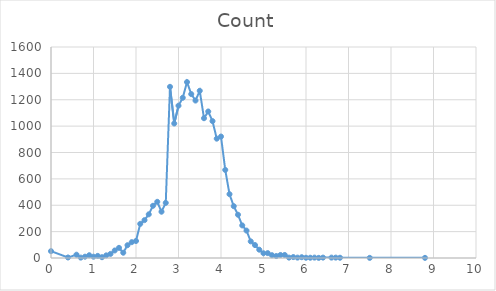
| Category | Count |
|---|---|
| 0.0 | 52 |
| 0.4 | 4 |
| 0.6 | 25 |
| 0.7 | 3 |
| 0.8 | 10 |
| 0.9 | 21 |
| 1.0 | 10 |
| 1.1 | 16 |
| 1.2 | 6 |
| 1.3 | 20 |
| 1.4 | 31 |
| 1.5 | 57 |
| 1.6 | 77 |
| 1.7 | 40 |
| 1.8 | 97 |
| 1.9 | 120 |
| 2.0 | 129 |
| 2.1 | 259 |
| 2.2 | 287 |
| 2.3 | 331 |
| 2.4 | 396 |
| 2.5 | 426 |
| 2.6 | 351 |
| 2.7 | 418 |
| 2.8 | 1298 |
| 2.9 | 1020 |
| 3.0 | 1155 |
| 3.1 | 1215 |
| 3.2 | 1334 |
| 3.3 | 1243 |
| 3.4 | 1194 |
| 3.5 | 1268 |
| 3.6 | 1060 |
| 3.7 | 1111 |
| 3.8 | 1038 |
| 3.9 | 905 |
| 4.0 | 921 |
| 4.1 | 668 |
| 4.2 | 484 |
| 4.3 | 393 |
| 4.4 | 328 |
| 4.5 | 247 |
| 4.6 | 208 |
| 4.7 | 126 |
| 4.8 | 98 |
| 4.9 | 63 |
| 5.0 | 36 |
| 5.1 | 37 |
| 5.2 | 21 |
| 5.3 | 15 |
| 5.4 | 23 |
| 5.5 | 23 |
| 5.6 | 3 |
| 5.7 | 7 |
| 5.8 | 3 |
| 5.9 | 6 |
| 6.0 | 2 |
| 6.1 | 2 |
| 6.2 | 3 |
| 6.3 | 1 |
| 6.4 | 3 |
| 6.6 | 3 |
| 6.7 | 3 |
| 6.8 | 2 |
| 7.5 | 1 |
| 8.8 | 1 |